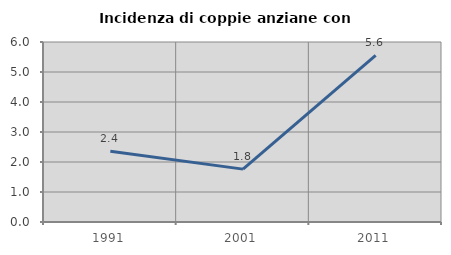
| Category | Incidenza di coppie anziane con figli |
|---|---|
| 1991.0 | 2.358 |
| 2001.0 | 1.762 |
| 2011.0 | 5.556 |